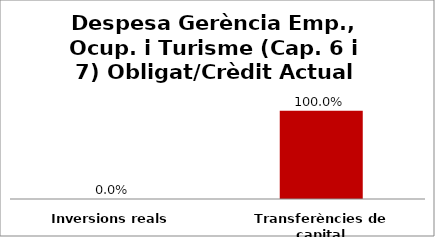
| Category | Series 0 |
|---|---|
| Inversions reals | 0 |
| Transferències de capital | 1 |